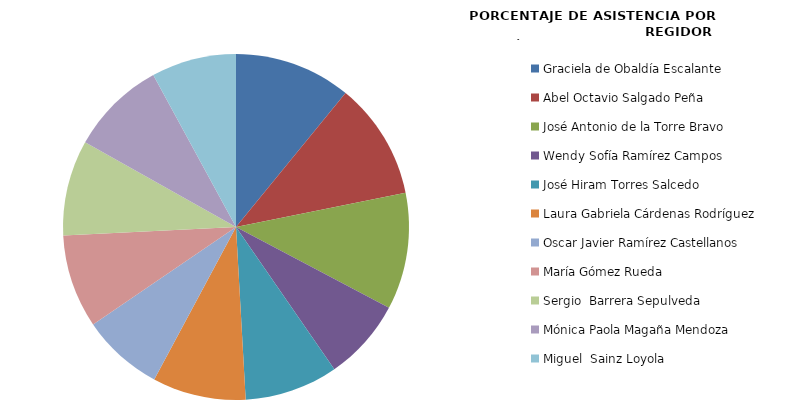
| Category | Series 0 |
|---|---|
| Graciela de Obaldía Escalante | 100 |
| Abel Octavio Salgado Peña | 100 |
| José Antonio de la Torre Bravo | 100 |
| Wendy Sofía Ramírez Campos | 70 |
| José Hiram Torres Salcedo | 80 |
| Laura Gabriela Cárdenas Rodríguez | 80 |
| Oscar Javier Ramírez Castellanos | 70 |
| María Gómez Rueda | 80 |
| Sergio  Barrera Sepulveda | 81.818 |
| Mónica Paola Magaña Mendoza | 81.818 |
| Miguel  Sainz Loyola | 72.727 |